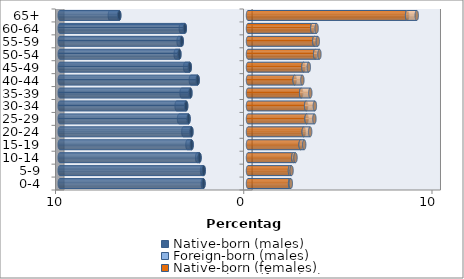
| Category | Native-born (males) | Foreign-born (males) | Native-born (females) | Foreign-born (females) |
|---|---|---|---|---|
| 0-4 | -2.365 | -0.038 | 2.236 | 0.038 |
| 5-9 | -2.354 | -0.085 | 2.23 | 0.083 |
| 10-14 | -2.576 | -0.125 | 2.406 | 0.118 |
| 15-19 | -2.996 | -0.22 | 2.796 | 0.188 |
| 20-24 | -3.006 | -0.429 | 2.961 | 0.341 |
| 25-29 | -3.159 | -0.504 | 3.112 | 0.414 |
| 30-34 | -3.286 | -0.506 | 3.089 | 0.464 |
| 35-39 | -3.06 | -0.467 | 2.823 | 0.486 |
| 40-44 | -2.674 | -0.361 | 2.478 | 0.41 |
| 45-49 | -3.095 | -0.244 | 2.945 | 0.286 |
| 50-54 | -3.646 | -0.196 | 3.568 | 0.226 |
| 55-59 | -3.52 | -0.167 | 3.523 | 0.185 |
| 60-64 | -3.356 | -0.214 | 3.417 | 0.227 |
| 65+ | -6.841 | -0.499 | 8.452 | 0.513 |